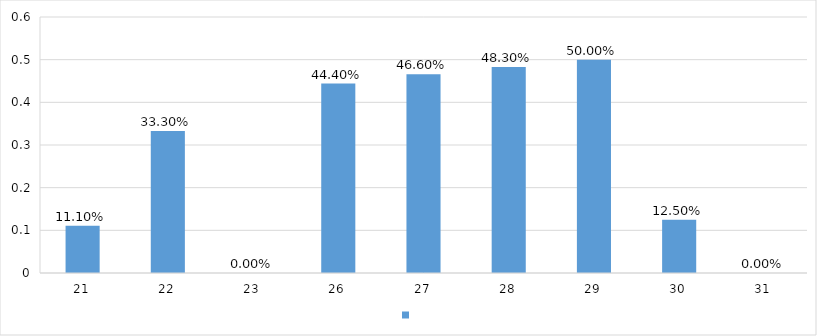
| Category | Series 0 |
|---|---|
| 21 | 0.111 |
| 22 | 0.333 |
| 23 | 0 |
| 26 | 0.444 |
| 27 | 0.466 |
| 28 | 0.483 |
| 29 | 0.5 |
| 30 | 0.125 |
| 31 | 0 |